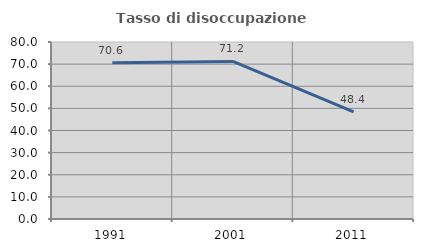
| Category | Tasso di disoccupazione giovanile  |
|---|---|
| 1991.0 | 70.606 |
| 2001.0 | 71.207 |
| 2011.0 | 48.402 |